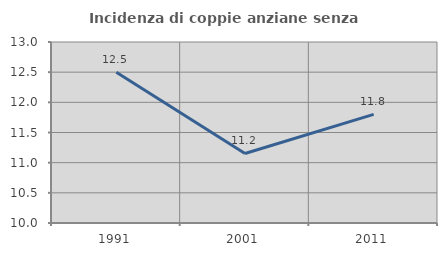
| Category | Incidenza di coppie anziane senza figli  |
|---|---|
| 1991.0 | 12.5 |
| 2001.0 | 11.152 |
| 2011.0 | 11.801 |